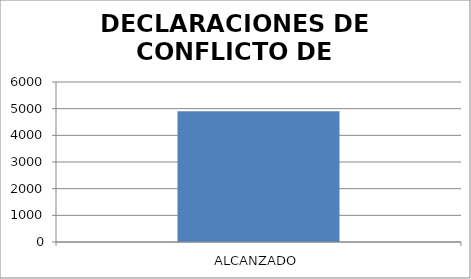
| Category | DECLARACIONES DE CONFLICTO DE INTERESES |
|---|---|
| ALCANZADO | 4899 |